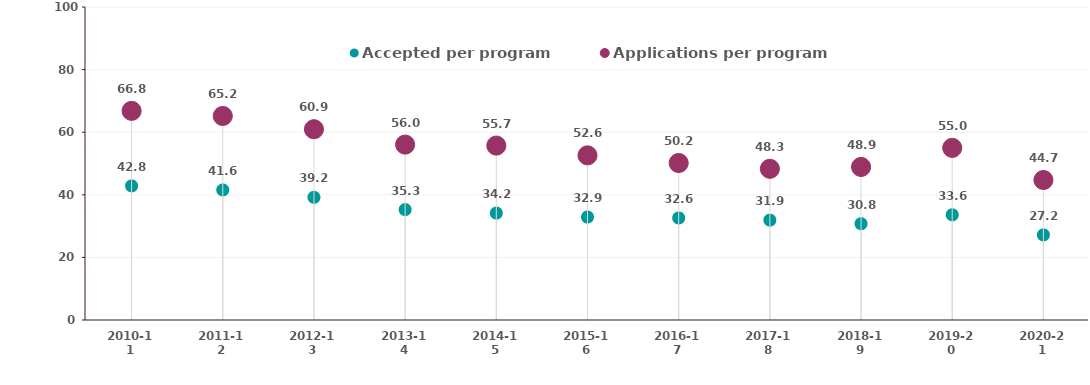
| Category | Accepted per program | Applications per program |
|---|---|---|
| 2010-11 | 42.839 | 66.817 |
| 2011-12 | 41.557 | 65.181 |
| 2012-13 | 39.198 | 60.95 |
| 2013-14 | 35.275 | 56.044 |
| 2014-15 | 34.154 | 55.724 |
| 2015-16 | 32.909 | 52.597 |
| 2016-17 | 32.599 | 50.152 |
| 2017-18 | 31.913 | 48.304 |
| 2018-19 | 30.764 | 48.894 |
| 2019-20 | 33.612 | 54.992 |
| 2020-21 | 27.183 | 44.725 |